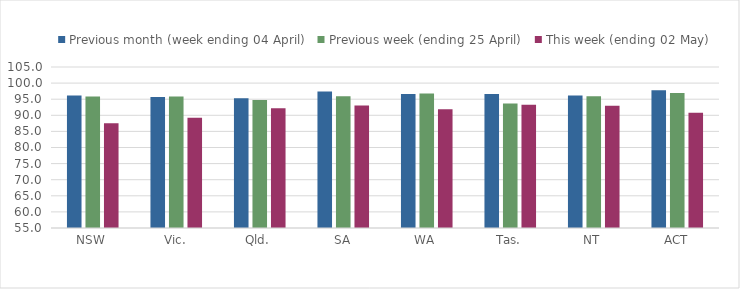
| Category | Previous month (week ending 04 April) | Previous week (ending 25 April) | This week (ending 02 May) |
|---|---|---|---|
| NSW | 96.145 | 95.842 | 87.562 |
| Vic. | 95.659 | 95.84 | 89.222 |
| Qld. | 95.26 | 94.731 | 92.199 |
| SA | 97.421 | 95.903 | 93.076 |
| WA | 96.601 | 96.747 | 91.903 |
| Tas. | 96.633 | 93.695 | 93.288 |
| NT | 96.113 | 95.932 | 92.952 |
| ACT | 97.791 | 96.929 | 90.827 |